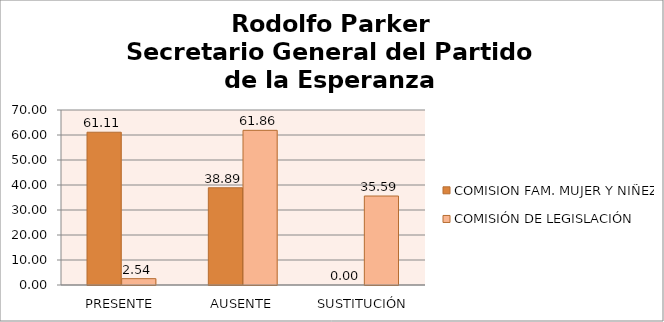
| Category | COMISION FAM. MUJER Y NIÑEZ | COMISIÓN DE LEGISLACIÓN |
|---|---|---|
| PRESENTE | 61.111 | 2.542 |
| AUSENTE | 38.889 | 61.864 |
| SUSTITUCIÓN | 0 | 35.593 |